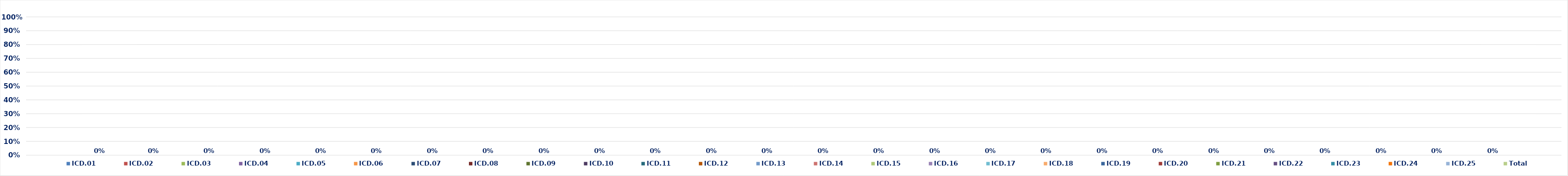
| Category | ICD.01 | ICD.02 | ICD.03 | ICD.04 | ICD.05 | ICD.06 | ICD.07 | ICD.08 | ICD.09 | ICD.10 | ICD.11 | ICD.12 | ICD.13 | ICD.14 | ICD.15 | ICD.16 | ICD.17 | ICD.18 | ICD.19 | ICD.20 | ICD.21 | ICD.22 | ICD.23 | ICD.24 | ICD.25 | Total |
|---|---|---|---|---|---|---|---|---|---|---|---|---|---|---|---|---|---|---|---|---|---|---|---|---|---|---|
| 0 | 0 | 0 | 0 | 0 | 0 | 0 | 0 | 0 | 0 | 0 | 0 | 0 | 0 | 0 | 0 | 0 | 0 | 0 | 0 | 0 | 0 | 0 | 0 | 0 | 0 | 0 |